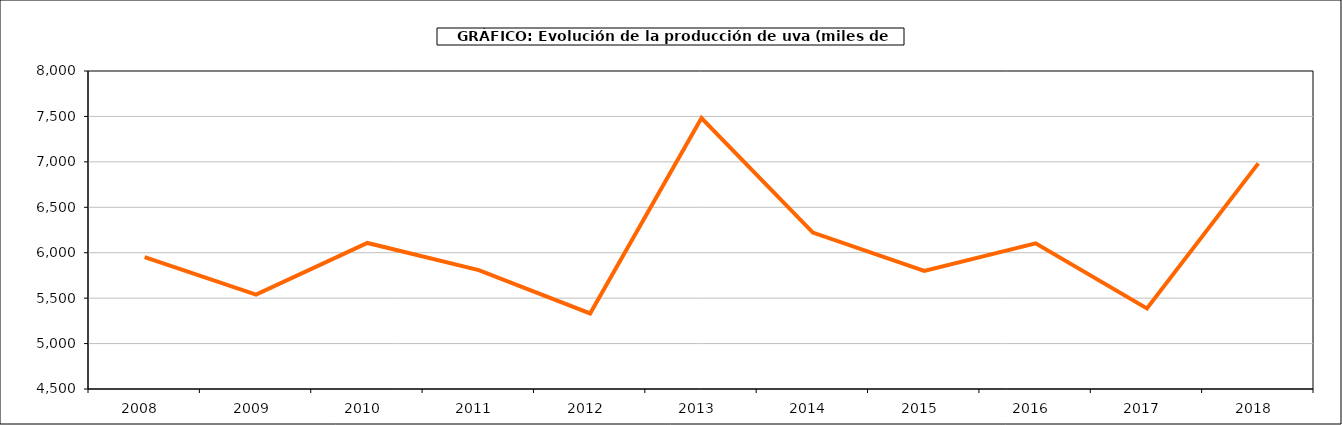
| Category | producción |
|---|---|
| 2008  | 5951.581 |
| 2009  | 5538.893 |
| 2010  | 6107.616 |
| 2011  | 5809.315 |
| 2012  | 5332.163 |
| 2013  | 7482.539 |
| 2014  | 6221.76 |
| 2015  | 5799.127 |
| 2016  | 6102.851 |
| 2017  | 5387.379 |
| 2018  | 6983.401 |